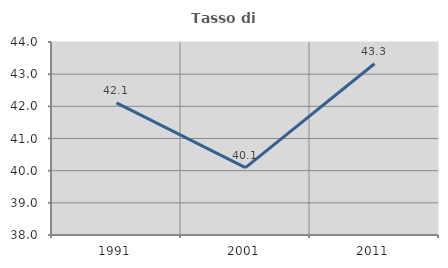
| Category | Tasso di occupazione   |
|---|---|
| 1991.0 | 42.109 |
| 2001.0 | 40.095 |
| 2011.0 | 43.324 |